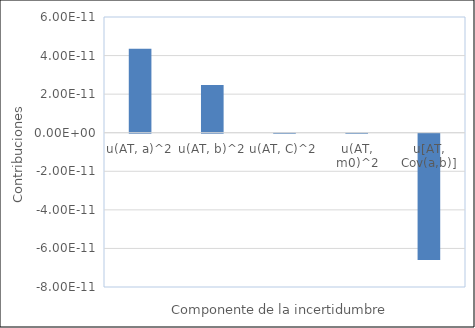
| Category | Series 0 |
|---|---|
| u(AT, a)^2 | 0 |
| u(AT, b)^2 | 0 |
| u(AT, C)^2 | 0 |
| u(AT, m0)^2 | 0 |
| u[AT, Cov(a,b)] | 0 |